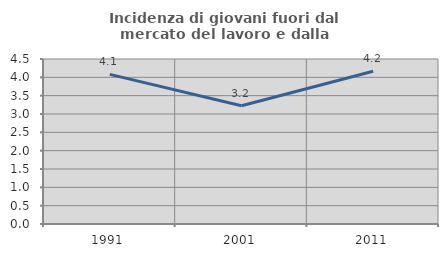
| Category | Incidenza di giovani fuori dal mercato del lavoro e dalla formazione  |
|---|---|
| 1991.0 | 4.082 |
| 2001.0 | 3.226 |
| 2011.0 | 4.167 |